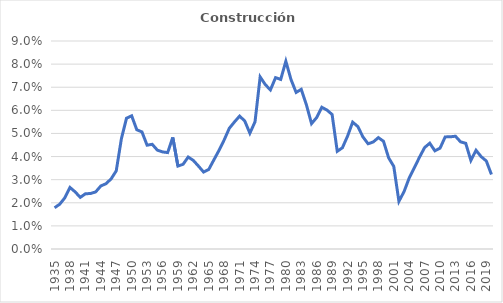
| Category | Construcción |
|---|---|
| 1935.0 | 0.018 |
| 1936.0 | 0.019 |
| 1937.0 | 0.022 |
| 1938.0 | 0.027 |
| 1939.0 | 0.025 |
| 1940.0 | 0.022 |
| 1941.0 | 0.024 |
| 1942.0 | 0.024 |
| 1943.0 | 0.025 |
| 1944.0 | 0.027 |
| 1945.0 | 0.028 |
| 1946.0 | 0.03 |
| 1947.0 | 0.034 |
| 1948.0 | 0.048 |
| 1949.0 | 0.057 |
| 1950.0 | 0.058 |
| 1951.0 | 0.052 |
| 1952.0 | 0.051 |
| 1953.0 | 0.045 |
| 1954.0 | 0.045 |
| 1955.0 | 0.043 |
| 1956.0 | 0.042 |
| 1957.0 | 0.042 |
| 1958.0 | 0.048 |
| 1959.0 | 0.036 |
| 1960.0 | 0.037 |
| 1961.0 | 0.04 |
| 1962.0 | 0.038 |
| 1963.0 | 0.036 |
| 1964.0 | 0.033 |
| 1965.0 | 0.034 |
| 1966.0 | 0.039 |
| 1967.0 | 0.043 |
| 1968.0 | 0.047 |
| 1969.0 | 0.052 |
| 1970.0 | 0.055 |
| 1971.0 | 0.057 |
| 1972.0 | 0.055 |
| 1973.0 | 0.05 |
| 1974.0 | 0.055 |
| 1975.0 | 0.074 |
| 1976.0 | 0.071 |
| 1977.0 | 0.069 |
| 1978.0 | 0.074 |
| 1979.0 | 0.073 |
| 1980.0 | 0.081 |
| 1981.0 | 0.073 |
| 1982.0 | 0.068 |
| 1983.0 | 0.069 |
| 1984.0 | 0.062 |
| 1985.0 | 0.054 |
| 1986.0 | 0.057 |
| 1987.0 | 0.061 |
| 1988.0 | 0.06 |
| 1989.0 | 0.058 |
| 1990.0 | 0.042 |
| 1991.0 | 0.044 |
| 1992.0 | 0.049 |
| 1993.0 | 0.055 |
| 1994.0 | 0.053 |
| 1995.0 | 0.048 |
| 1996.0 | 0.046 |
| 1997.0 | 0.046 |
| 1998.0 | 0.048 |
| 1999.0 | 0.047 |
| 2000.0 | 0.039 |
| 2001.0 | 0.036 |
| 2002.0 | 0.021 |
| 2003.0 | 0.025 |
| 2004.0 | 0.031 |
| 2005.0 | 0.035 |
| 2006.0 | 0.04 |
| 2007.0 | 0.044 |
| 2008.0 | 0.046 |
| 2009.0 | 0.042 |
| 2010.0 | 0.044 |
| 2011.0 | 0.049 |
| 2012.0 | 0.049 |
| 2013.0 | 0.049 |
| 2014.0 | 0.046 |
| 2015.0 | 0.046 |
| 2016.0 | 0.038 |
| 2017.0 | 0.043 |
| 2018.0 | 0.04 |
| 2019.0 | 0.038 |
| 2020.0 | 0.032 |